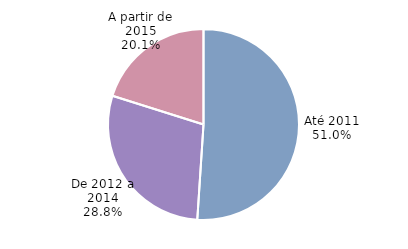
| Category | Series 0 |
|---|---|
| Até 2011 | 0.51 |
| De 2012 a 2014 | 0.288 |
| A partir de 2015 | 0.201 |